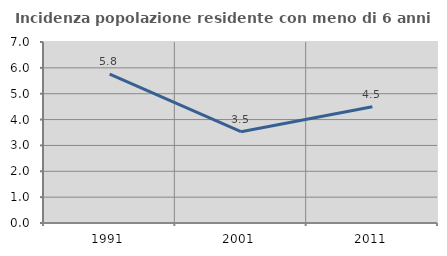
| Category | Incidenza popolazione residente con meno di 6 anni |
|---|---|
| 1991.0 | 5.762 |
| 2001.0 | 3.529 |
| 2011.0 | 4.499 |